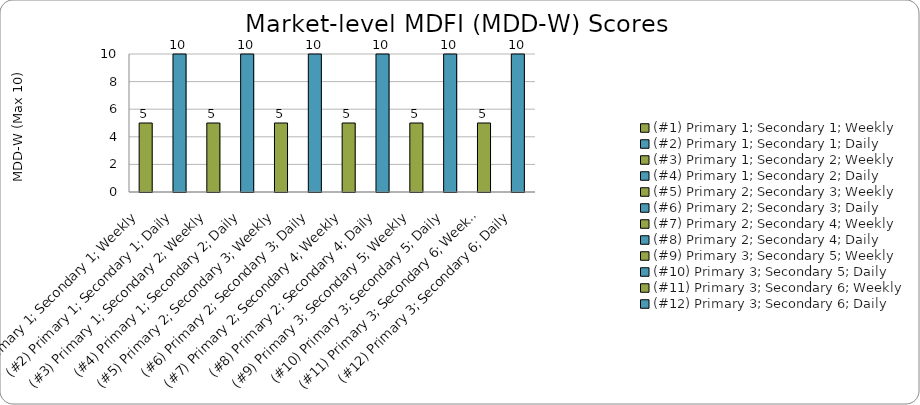
| Category | Series 0 |
|---|---|
| (#1) Primary 1; Secondary 1; Weekly | 5 |
| (#2) Primary 1; Secondary 1; Daily | 10 |
| (#3) Primary 1; Secondary 2; Weekly | 5 |
| (#4) Primary 1; Secondary 2; Daily | 10 |
| (#5) Primary 2; Secondary 3; Weekly | 5 |
| (#6) Primary 2; Secondary 3; Daily | 10 |
| (#7) Primary 2; Secondary 4; Weekly | 5 |
| (#8) Primary 2; Secondary 4; Daily | 10 |
| (#9) Primary 3; Secondary 5; Weekly | 5 |
| (#10) Primary 3; Secondary 5; Daily | 10 |
| (#11) Primary 3; Secondary 6; Weekly | 5 |
| (#12) Primary 3; Secondary 6; Daily | 10 |